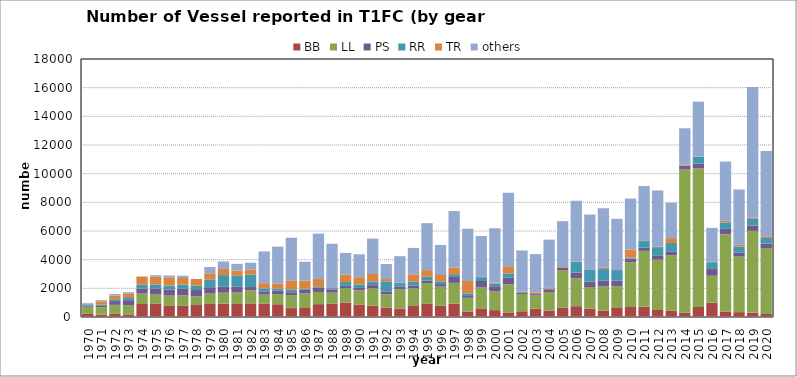
| Category | BB | LL | PS | RR | TR | others |
|---|---|---|---|---|---|---|
| 1970.0 | 214 | 503 | 79 | 91 | 0 | 74 |
| 1971.0 | 157 | 526 | 94 | 79 | 242 | 75 |
| 1972.0 | 247 | 602 | 262 | 129 | 250 | 117 |
| 1973.0 | 184 | 648 | 344 | 151 | 284 | 118 |
| 1974.0 | 905 | 731 | 350 | 269 | 568 | 0 |
| 1975.0 | 918 | 660 | 410 | 279 | 558 | 95 |
| 1976.0 | 776 | 720 | 422 | 274 | 578 | 125 |
| 1977.0 | 778 | 731 | 455 | 296 | 461 | 160 |
| 1978.0 | 838 | 608 | 435 | 306 | 465 | 5 |
| 1979.0 | 912 | 730 | 434 | 544 | 429 | 441 |
| 1980.0 | 935 | 765 | 406 | 819 | 430 | 519 |
| 1981.0 | 912 | 795 | 420 | 746 | 367 | 466 |
| 1982.0 | 950 | 920 | 220 | 870 | 361 | 464 |
| 1983.0 | 919 | 644 | 226 | 215 | 355 | 2213 |
| 1984.0 | 890 | 712 | 228 | 151 | 345 | 2580 |
| 1985.0 | 620 | 904 | 203 | 201 | 628 | 2976 |
| 1986.0 | 627 | 1014 | 252 | 83 | 571 | 1307 |
| 1987.0 | 896 | 851 | 295 | 59 | 547 | 3167 |
| 1988.0 | 921 | 776 | 233 | 81 | 16 | 3084 |
| 1989.0 | 1014 | 1001 | 160 | 269 | 505 | 1521 |
| 1990.0 | 851 | 1008 | 167 | 248 | 500 | 1602 |
| 1991.0 | 803 | 1185 | 235 | 260 | 519 | 2469 |
| 1992.0 | 661 | 921 | 205 | 698 | 161 | 1053 |
| 1993.0 | 573 | 1356 | 182 | 258 | 38 | 1838 |
| 1994.0 | 770 | 1228 | 198 | 258 | 523 | 1842 |
| 1995.0 | 914 | 1459 | 177 | 255 | 466 | 3276 |
| 1996.0 | 782 | 1337 | 176 | 192 | 444 | 2096 |
| 1997.0 | 927 | 1455 | 413 | 192 | 465 | 3936 |
| 1998.0 | 381 | 960 | 125 | 186 | 860 | 3649 |
| 1999.0 | 602 | 1459 | 452 | 266 | 18 | 2851 |
| 2000.0 | 480 | 1304 | 365 | 197 | 58 | 3789 |
| 2001.0 | 322 | 1958 | 485 | 274 | 501 | 5136 |
| 2002.0 | 401 | 1208 | 93 | 63 | 32 | 2847 |
| 2003.0 | 578 | 922 | 96 | 0 | 119 | 2675 |
| 2004.0 | 453 | 1293 | 190 | 41 | 53 | 3369 |
| 2005.0 | 637 | 2609 | 201 | 27 | 75 | 3137 |
| 2006.0 | 754 | 1942 | 407 | 764 | 13 | 4229 |
| 2007.0 | 580 | 1512 | 377 | 852 | 5 | 3821 |
| 2008.0 | 439 | 1692 | 424 | 789 | 83 | 4161 |
| 2009.0 | 676 | 1469 | 388 | 742 | 5 | 3573 |
| 2010.0 | 700 | 3109 | 264 | 78 | 546 | 3566 |
| 2011.0 | 714 | 3898 | 223 | 464 | 10 | 3828 |
| 2012.0 | 488 | 3513 | 264 | 612 | 35 | 3918 |
| 2013.0 | 451 | 3858 | 274 | 582 | 341 | 2459 |
| 2014.0 | 298 | 9991 | 260 | 26 | 74 | 2519 |
| 2015.0 | 704 | 9672 | 318 | 489 | 8 | 3833 |
| 2016.0 | 993 | 1886 | 472 | 471 | 22 | 2375 |
| 2017.0 | 366 | 5397 | 384 | 447 | 117 | 4135 |
| 2018.0 | 340 | 3877 | 274 | 430 | 114 | 3865 |
| 2019.0 | 308 | 5703 | 371 | 462 | 84 | 9119 |
| 2020.0 | 211 | 4598 | 318 | 386 | 112 | 5955 |